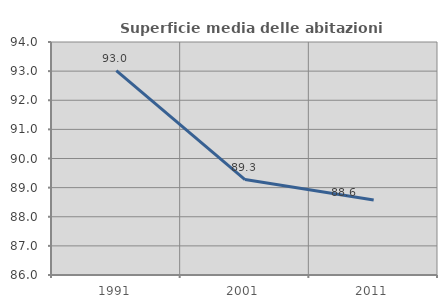
| Category | Superficie media delle abitazioni occupate |
|---|---|
| 1991.0 | 93.018 |
| 2001.0 | 89.276 |
| 2011.0 | 88.572 |